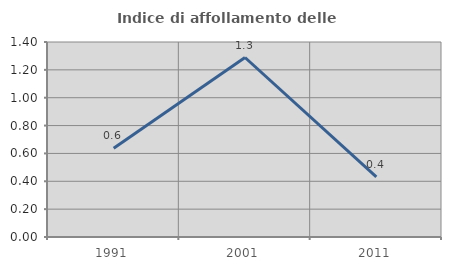
| Category | Indice di affollamento delle abitazioni  |
|---|---|
| 1991.0 | 0.637 |
| 2001.0 | 1.289 |
| 2011.0 | 0.432 |